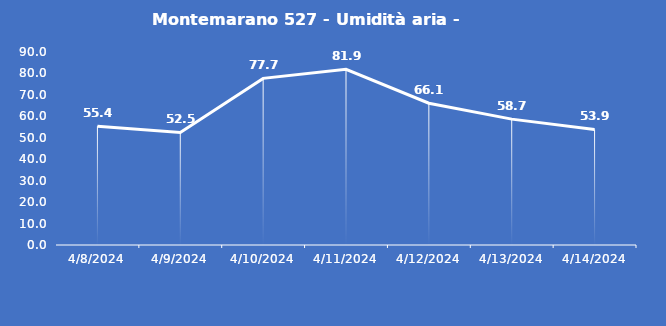
| Category | Montemarano 527 - Umidità aria - Grezzo (%) |
|---|---|
| 4/8/24 | 55.4 |
| 4/9/24 | 52.5 |
| 4/10/24 | 77.7 |
| 4/11/24 | 81.9 |
| 4/12/24 | 66.1 |
| 4/13/24 | 58.7 |
| 4/14/24 | 53.9 |